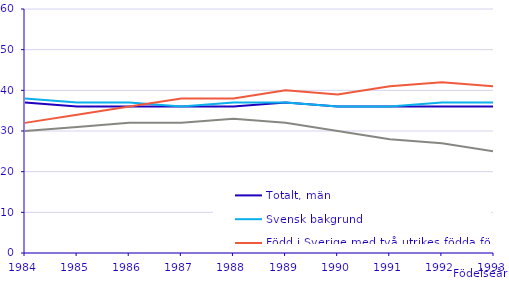
| Category | Totalt, män | Svensk bakgrund | Född i Sverige med två utrikes födda föräldrar | Utrikes född |
|---|---|---|---|---|
| 1984.0 | 37 | 38 | 32 | 30 |
| 1985.0 | 36 | 37 | 34 | 31 |
| 1986.0 | 36 | 37 | 36 | 32 |
| 1987.0 | 36 | 36 | 38 | 32 |
| 1988.0 | 36 | 37 | 38 | 33 |
| 1989.0 | 37 | 37 | 40 | 32 |
| 1990.0 | 36 | 36 | 39 | 30 |
| 1991.0 | 36 | 36 | 41 | 28 |
| 1992.0 | 36 | 37 | 42 | 27 |
| 1993.0 | 36 | 37 | 41 | 25 |